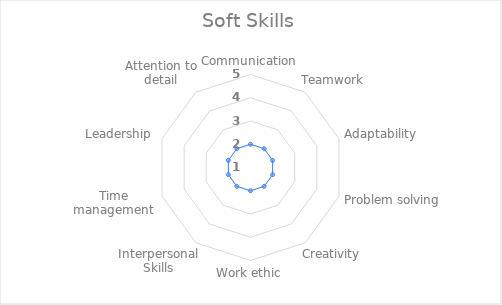
| Category | Series 0 |
|---|---|
| Communication | 0 |
| Teamwork | 0 |
| Adaptability | 0 |
| Problem solving | 0 |
| Creativity | 0 |
| Work ethic | 0 |
| Interpersonal Skills | 0 |
| Time management | 0 |
| Leadership | 0 |
| Attention to detail | 0 |